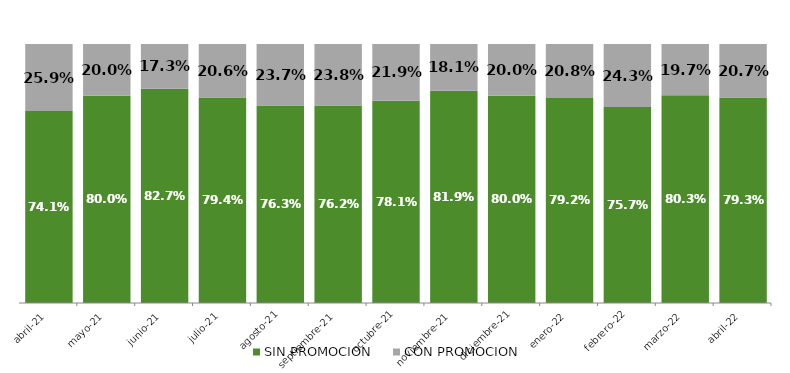
| Category | SIN PROMOCION   | CON PROMOCION   |
|---|---|---|
| 2021-04-01 | 0.741 | 0.259 |
| 2021-05-01 | 0.8 | 0.2 |
| 2021-06-01 | 0.827 | 0.173 |
| 2021-07-01 | 0.794 | 0.206 |
| 2021-08-01 | 0.763 | 0.237 |
| 2021-09-01 | 0.762 | 0.238 |
| 2021-10-01 | 0.781 | 0.219 |
| 2021-11-01 | 0.819 | 0.181 |
| 2021-12-01 | 0.8 | 0.2 |
| 2022-01-01 | 0.792 | 0.208 |
| 2022-02-01 | 0.757 | 0.243 |
| 2022-03-01 | 0.803 | 0.197 |
| 2022-04-01 | 0.793 | 0.207 |